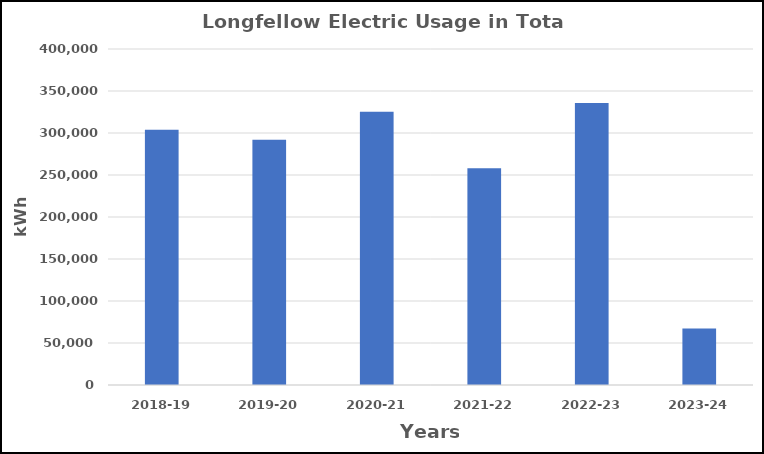
| Category | Series 0 |
|---|---|
| 2018-19 | 303726 |
| 2019-20 | 291912 |
| 2020-21 | 325309 |
| 2021-22 | 258163 |
| 2022-23 | 335810 |
| 2023-24 | 67194 |